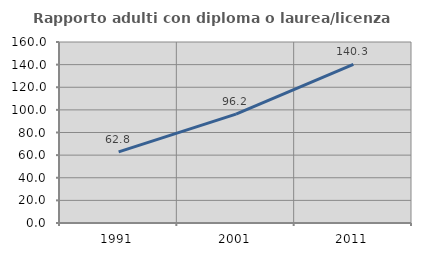
| Category | Rapporto adulti con diploma o laurea/licenza media  |
|---|---|
| 1991.0 | 62.824 |
| 2001.0 | 96.198 |
| 2011.0 | 140.317 |